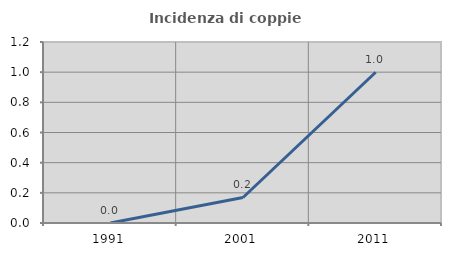
| Category | Incidenza di coppie miste |
|---|---|
| 1991.0 | 0 |
| 2001.0 | 0.169 |
| 2011.0 | 0.999 |